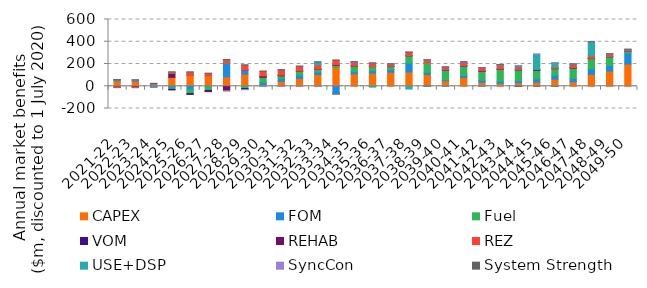
| Category | CAPEX | FOM | Fuel | VOM | REHAB | REZ | USE+DSP | SyncCon | System Strength |
|---|---|---|---|---|---|---|---|---|---|
| 2021-22 | 48.848 | 9.894 | -6.894 | -3.654 | 0 | -2.27 | 0 | 0.138 | 0.591 |
| 2022-23 | 46.611 | 9.44 | -5.603 | -5.459 | 0 | -2.166 | 0 | 0.148 | 0.564 |
| 2023-24 | 19.934 | 4.057 | -7.226 | -0.24 | 0 | 1.443 | -0.029 | -0.123 | 0.513 |
| 2024-25 | 79.983 | -13.767 | -14.351 | -4.9 | 34.936 | 9.948 | 0.984 | 0.856 | 1.708 |
| 2025-26 | 102.83 | -31.098 | -34.918 | -7.434 | 1.082 | 20.439 | 1.042 | 0.741 | 2.281 |
| 2026-27 | 91.497 | -6.481 | -31.741 | -7.366 | -3.049 | 21.906 | 0.991 | 0.905 | 1.966 |
| 2027-28 | 83.994 | 123.78 | 2.447 | -6.406 | -33.893 | 28.593 | 0.145 | -0.927 | 1.963 |
| 2028-29 | 108.058 | 37.081 | -20.194 | -8.475 | 0 | 44.74 | -1.139 | -0.844 | 2.314 |
| 2029-30 | 16.446 | 17.57 | 47.419 | 5.215 | 5.45 | 42.691 | -1.259 | -1.382 | 1.054 |
| 2030-31 | 45.462 | 23.437 | 25.115 | 5.048 | 0 | 47.955 | 0.224 | -1.054 | 1.641 |
| 2031-32 | 71.111 | 27.866 | 38.165 | 0.258 | 0 | 40.731 | 1.154 | -0.767 | 1.652 |
| 2032-33 | 104.215 | 23.861 | 23.492 | 1.947 | 0 | 37.713 | 27.034 | -0.021 | 1.198 |
| 2033-34 | 169.108 | -64.241 | 18.713 | -3.037 | 5.79 | 39.938 | -5.135 | -0.114 | 1.782 |
| 2034-35 | 111.652 | 19.209 | 51.28 | 1.739 | 0 | 29.631 | 6.099 | 0.057 | 0.775 |
| 2035-36 | 117.641 | 22.566 | 36.347 | 1.163 | 0 | 30.292 | -8.009 | 0.16 | 0.928 |
| 2036-37 | 126.68 | 23.533 | 26.753 | 1.762 | 0.039 | 21.052 | 0.312 | 0.098 | 0.338 |
| 2037-38 | 128.508 | 79.647 | 65.499 | 1.865 | 0 | 30.027 | -25.349 | 0.168 | 1.643 |
| 2038-39 | 105.843 | 19.035 | 85.088 | -0.439 | 0 | 26.471 | -0.085 | 0.116 | 1.075 |
| 2039-40 | 49.491 | 8.653 | 87.841 | 4.251 | 0 | 22.377 | -2.298 | 0.168 | 0.523 |
| 2040-41 | 78.71 | 17.54 | 86.525 | 1.288 | 0 | 31.353 | 2.318 | 0.297 | 1.74 |
| 2041-42 | 36.006 | 18.786 | 80.018 | 3.918 | 0.084 | 27.022 | -1.577 | 0.337 | 0.578 |
| 2042-43 | 25.615 | 18.116 | 109.167 | 2.939 | 0 | 31.808 | 6.775 | 0.026 | 0.243 |
| 2043-44 | 31.096 | 19.716 | 95.936 | 3.429 | -0.75 | 23.938 | 12.529 | 0.289 | -0.18 |
| 2044-45 | 37.151 | 27.791 | 77.636 | 6.304 | 0 | 2.972 | 137.129 | 0.281 | -0.683 |
| 2045-46 | 63.686 | 33.651 | 60.451 | 2.493 | 0 | 12.721 | 39.622 | 0.166 | -0.346 |
| 2046-47 | 41.99 | 27.868 | 94.646 | 3.536 | 0.418 | 25.616 | 5.76 | 0.09 | 0.16 |
| 2047-48 | 106.324 | 50.346 | 91.527 | 2.385 | 0 | 23.465 | 125.585 | 0.085 | 0.335 |
| 2048-49 | 136.291 | 51.034 | 77.453 | 2.271 | 0 | 21.113 | 3.03 | 0.175 | 0.089 |
| 2049-50 | 198.814 | 98.726 | 16.506 | 1.305 | 0 | 10.183 | 6.185 | 0.29 | 0.6 |